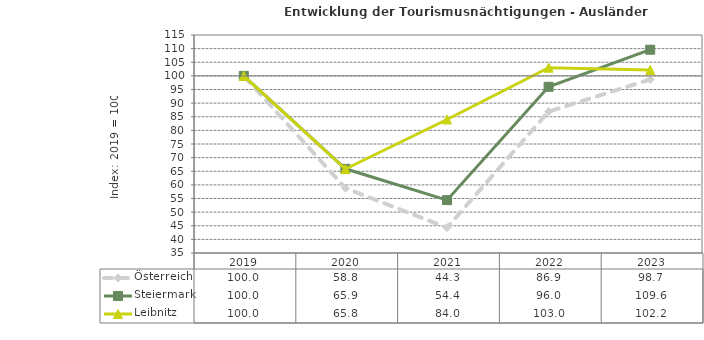
| Category | Österreich | Steiermark | Leibnitz |
|---|---|---|---|
| 2023.0 | 98.7 | 109.6 | 102.2 |
| 2022.0 | 86.9 | 96 | 103 |
| 2021.0 | 44.3 | 54.4 | 84 |
| 2020.0 | 58.8 | 65.9 | 65.8 |
| 2019.0 | 100 | 100 | 100 |